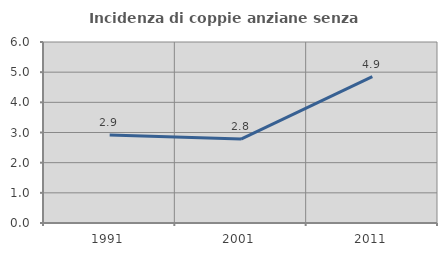
| Category | Incidenza di coppie anziane senza figli  |
|---|---|
| 1991.0 | 2.921 |
| 2001.0 | 2.783 |
| 2011.0 | 4.853 |